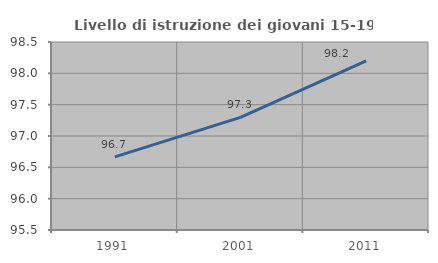
| Category | Livello di istruzione dei giovani 15-19 anni |
|---|---|
| 1991.0 | 96.667 |
| 2001.0 | 97.297 |
| 2011.0 | 98.198 |